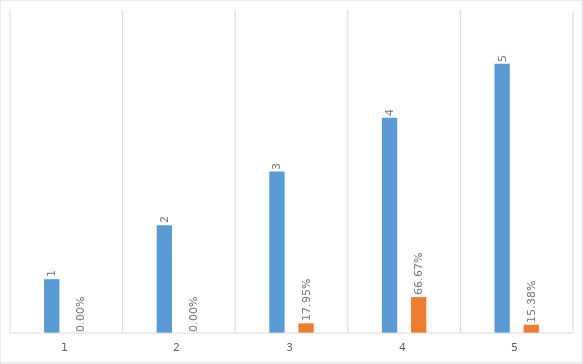
| Category | Series 0 | Series 1 |
|---|---|---|
| 0 | 1 | 0 |
| 1 | 2 | 0 |
| 2 | 3 | 0.179 |
| 3 | 4 | 0.667 |
| 4 | 5 | 0.154 |